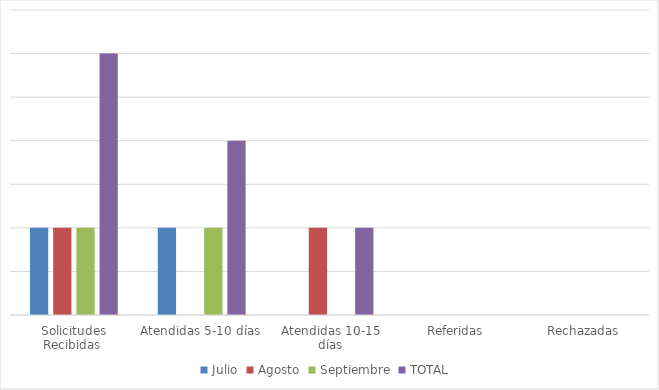
| Category | Julio | Agosto | Septiembre | TOTAL  |
|---|---|---|---|---|
| Solicitudes Recibidas  | 1 | 1 | 1 | 3 |
| Atendidas 5-10 días | 1 | 0 | 1 | 2 |
| Atendidas 10-15 días | 0 | 1 | 0 | 1 |
| Referidas | 0 | 0 | 0 | 0 |
| Rechazadas | 0 | 0 | 0 | 0 |